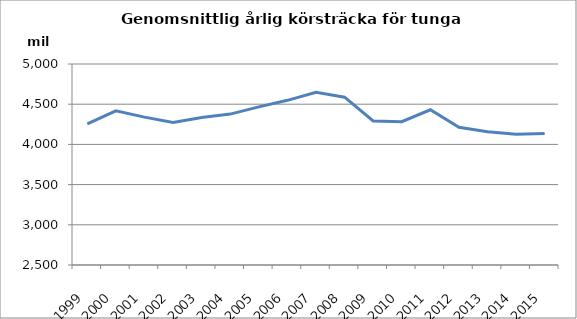
| Category | Series 0 |
|---|---|
| 1999.0 | 4254.457 |
| 2000.0 | 4417.481 |
| 2001.0 | 4338.935 |
| 2002.0 | 4273.062 |
| 2003.0 | 4335.437 |
| 2004.0 | 4376.916 |
| 2005.0 | 4466.823 |
| 2006.0 | 4548.139 |
| 2007.0 | 4648.035 |
| 2008.0 | 4586.986 |
| 2009.0 | 4291.782 |
| 2010.0 | 4282.082 |
| 2011.0 | 4430.621 |
| 2012.0 | 4212.675 |
| 2013.0 | 4156.089 |
| 2014.0 | 4125.245 |
| 2015.0 | 4136.48 |